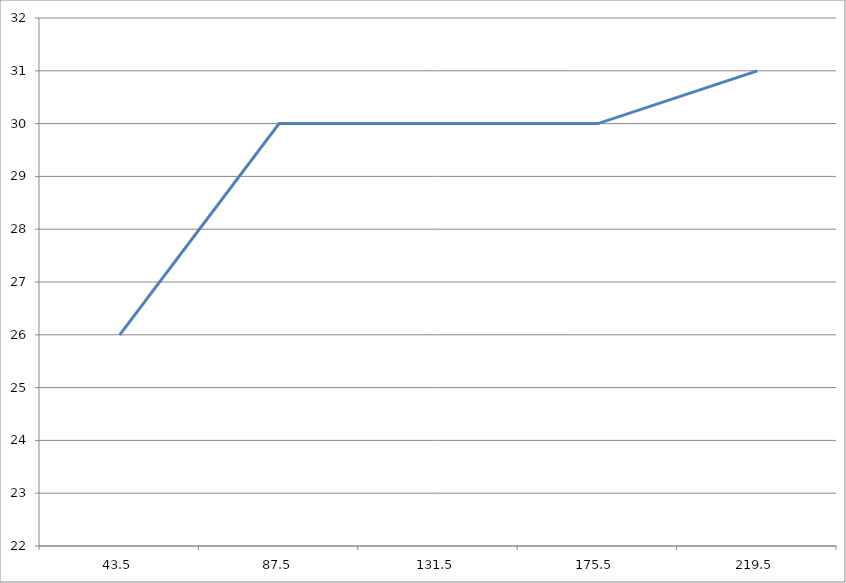
| Category | Series 0 |
|---|---|
| 43.5 | 26 |
| 87.5 | 30 |
| 131.5 | 30 |
| 175.5 | 30 |
| 219.5 | 31 |